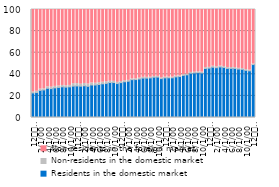
| Category | Residents in the domestic market | Non-residents in the domestic market | Non-residents in the foreign market |
|---|---|---|---|
| 12
2013 | 22.746 | 0.884 | 76.37 |
| 1 | 23.113 | 1.21 | 75.676 |
| 2 | 25.082 | 1.193 | 73.725 |
| 3 | 25.523 | 1.082 | 73.395 |
| 4 | 27.022 | 1.419 | 71.559 |
| 5 | 26.732 | 1.389 | 71.879 |
| 6 | 27.449 | 1.371 | 71.18 |
| 7 | 27.865 | 1.314 | 70.821 |
| 8 | 28.399 | 1.263 | 70.338 |
| 9 | 28.112 | 1.261 | 70.627 |
| 10 | 28.396 | 1.308 | 70.296 |
| 11 | 29.056 | 2.275 | 68.669 |
| 12
2014 | 29.222 | 2.157 | 68.621 |
| 1 | 28.996 | 1.846 | 69.158 |
| 2 | 29.375 | 2.156 | 68.469 |
| 3 | 28.86 | 2.123 | 69.017 |
| 4 | 30.112 | 1.915 | 67.972 |
| 5 | 30.094 | 1.642 | 68.263 |
| 6 | 30.54 | 1.666 | 67.794 |
| 7 | 31.186 | 1.524 | 67.29 |
| 8 | 31.557 | 1.585 | 66.858 |
| 9 | 32.403 | 1.199 | 66.398 |
| 10 | 32.369 | 1.176 | 66.455 |
| 11 | 31.432 | 1.144 | 67.424 |
| 12
2015 | 32.295 | 1.065 | 66.64 |
| 1 | 33.081 | 1.013 | 65.907 |
| 2 | 33.56 | 0.847 | 65.593 |
| 3 | 35.045 | 0.74 | 64.216 |
| 4 | 35.12 | 0.702 | 64.177 |
| 5 | 35.666 | 0.849 | 63.484 |
| 6 | 36.486 | 0.776 | 62.739 |
| 7 | 36.47 | 0.751 | 62.779 |
| 8 | 36.672 | 0.676 | 62.652 |
| 9 | 37.327 | 0.673 | 62 |
| 10 | 37.415 | 0.656 | 61.929 |
| 11 | 35.998 | 0.759 | 63.243 |
| 12
2016 | 36.713 | 0.701 | 62.586 |
| 1 | 36.757 | 0.676 | 62.567 |
| 2 | 36.741 | 0.675 | 62.584 |
| 3 | 37.619 | 0.726 | 61.655 |
| 4 | 37.923 | 0.745 | 61.332 |
| 5 | 38.982 | 0.741 | 60.277 |
| 6 | 39.517 | 0.655 | 59.828 |
| 7 | 41.023 | 0.695 | 58.282 |
| 8 | 41.301 | 0.699 | 58 |
| 9 | 41.537 | 0.776 | 57.687 |
| 10 | 41.277 | 0.747 | 57.976 |
| 11 | 45.37 | 0.839 | 53.792 |
| 12
2017 | 45.716 | 0.72 | 53.564 |
| 1 | 46.55 | 0.973 | 52.477 |
| 2 | 46.09 | 0.947 | 52.964 |
| 3 | 46.816 | 0.875 | 52.308 |
| 4 | 46.346 | 0.82 | 52.834 |
| 5 | 45.455 | 0.786 | 53.759 |
| 6 | 45.49 | 0.789 | 53.721 |
| 7 | 45.446 | 0.714 | 53.841 |
| 8 | 44.864 | 0.694 | 54.443 |
| 9 | 44.608 | 0.681 | 54.711 |
| 10 | 43.66 | 0.664 | 55.676 |
| 11 | 43.209 | 0.625 | 56.166 |
| 12
2018 | 49.022 | 0.553 | 50.425 |